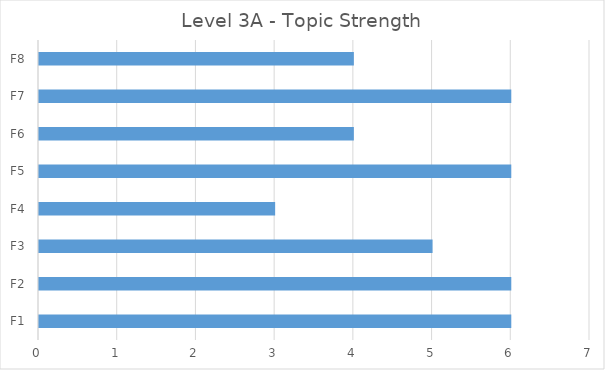
| Category | Series 0 |
|---|---|
| F1 | 6 |
| F2 | 6 |
| F3 | 5 |
| F4 | 3 |
| F5 | 6 |
| F6 | 4 |
| F7 | 6 |
| F8 | 4 |